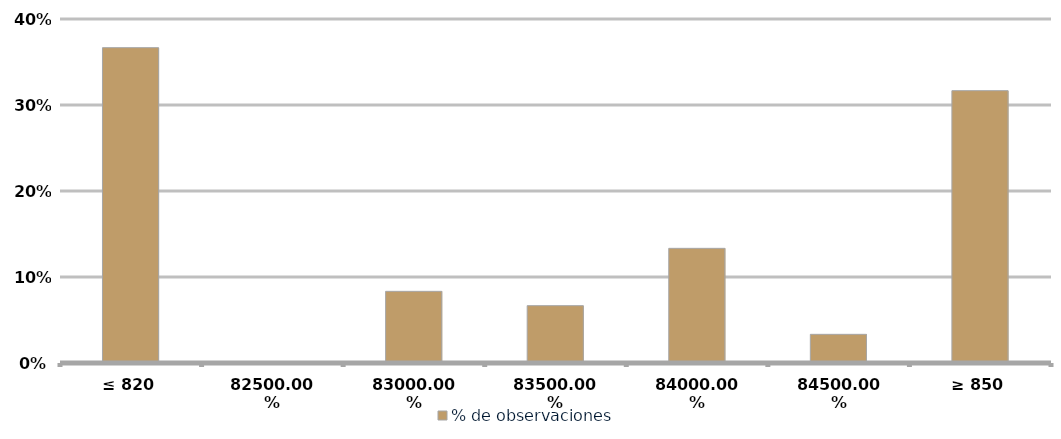
| Category | % de observaciones  |
|---|---|
| ≤ 820 | 0.367 |
| 825 | 0 |
| 830 | 0.083 |
| 835 | 0.067 |
| 840 | 0.133 |
| 845 | 0.033 |
| ≥ 850 | 0.317 |